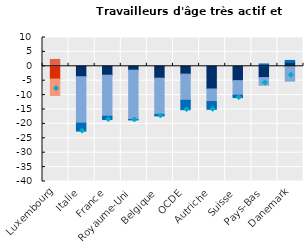
| Category | Heures par salarié en emploi | Emploi sans heures travaillées | Chômage (net de l'évolution démographique) |
|---|---|---|---|
| Luxembourg | -4.426 | -5.688 | 2.382 |
| Italie | -3.629 | -16.096 | -2.78 |
| France | -3.088 | -14.251 | -1.158 |
| Royaume-Uni | -1.347 | -17.116 | -0.159 |
| Belgique | -4.127 | -12.581 | -0.525 |
| OCDE | -2.714 | -9.09 | -3.266 |
| Autriche | -7.869 | -4.379 | -2.685 |
| Suisse | -4.977 | -5.056 | -0.84 |
| Pays-Bas | -3.907 | -2.676 | 0.806 |
| Danemark | 1.327 | -5.155 | 0.711 |